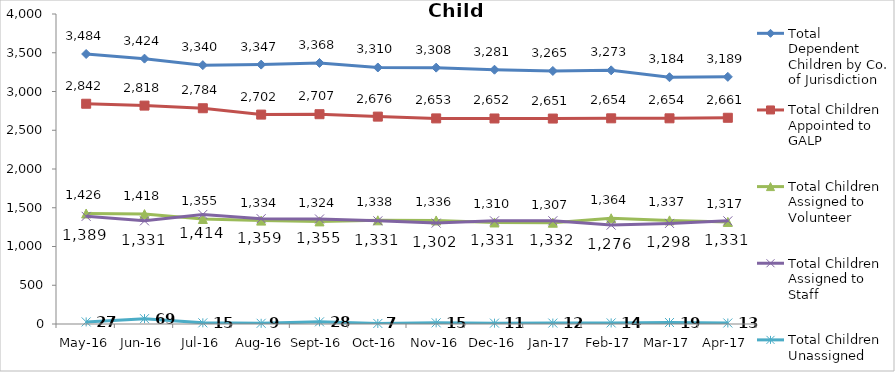
| Category | Total Dependent Children by Co. of Jurisdiction | Total Children Appointed to GALP | Total Children Assigned to Volunteer | Total Children Assigned to Staff | Total Children Unassigned |
|---|---|---|---|---|---|
| May-16 | 3484 | 2842 | 1426 | 1389 | 27 |
| Jun-16 | 3424 | 2818 | 1418 | 1331 | 69 |
| Jul-16 | 3340 | 2784 | 1355 | 1414 | 15 |
| Aug-16 | 3347 | 2702 | 1334 | 1359 | 9 |
| Sep-16 | 3368 | 2707 | 1324 | 1355 | 28 |
| Oct-16 | 3310 | 2676 | 1338 | 1331 | 7 |
| Nov-16 | 3308 | 2653 | 1336 | 1302 | 15 |
| Dec-16 | 3281 | 2652 | 1310 | 1331 | 11 |
| Jan-17 | 3265 | 2651 | 1307 | 1332 | 12 |
| Feb-17 | 3273 | 2654 | 1364 | 1276 | 14 |
| Mar-17 | 3184 | 2654 | 1337 | 1298 | 19 |
| Apr-17 | 3189 | 2661 | 1317 | 1331 | 13 |